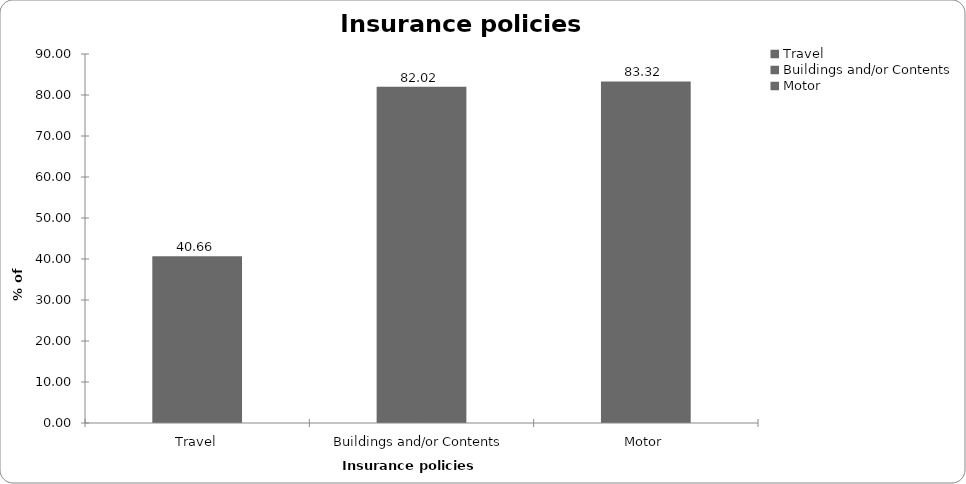
| Category | Insurance policies held |
|---|---|
| Travel | 40.659 |
| Buildings and/or Contents | 82.018 |
| Motor | 83.317 |